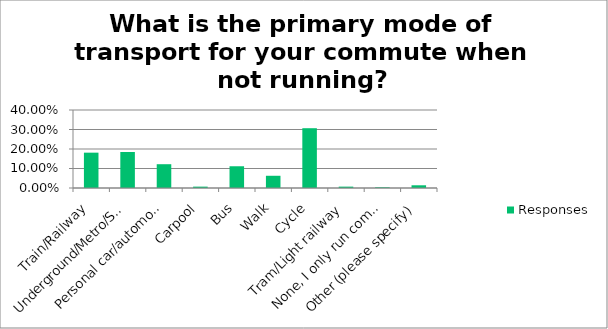
| Category | Responses |
|---|---|
| Train/Railway | 0.181 |
| Underground/Metro/Subway | 0.185 |
| Personal car/automobile | 0.122 |
| Carpool | 0.007 |
| Bus | 0.112 |
| Walk | 0.063 |
| Cycle | 0.307 |
| Tram/Light railway | 0.007 |
| None, I only run commute | 0.004 |
| Other (please specify) | 0.014 |